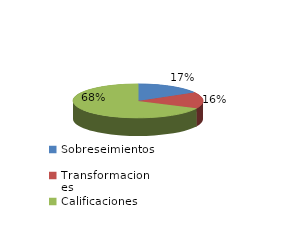
| Category | Series 0 |
|---|---|
| Sobreseimientos | 369 |
| Transformaciones | 348 |
| Calificaciones | 1506 |